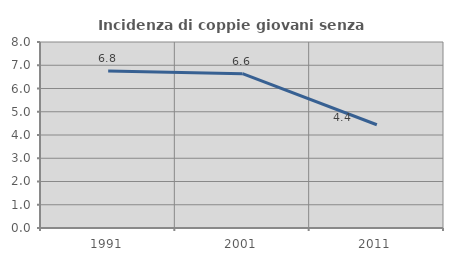
| Category | Incidenza di coppie giovani senza figli |
|---|---|
| 1991.0 | 6.758 |
| 2001.0 | 6.639 |
| 2011.0 | 4.44 |